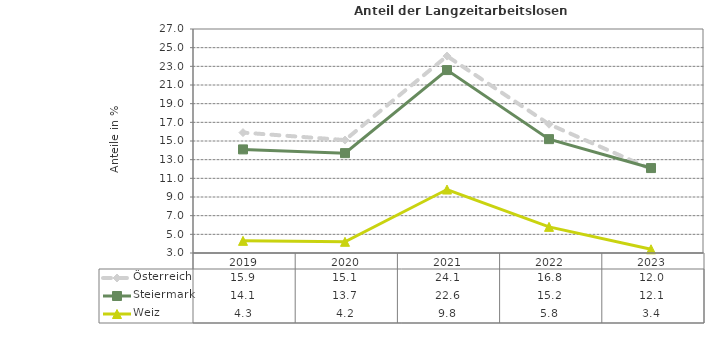
| Category | Österreich | Steiermark | Weiz |
|---|---|---|---|
| 2023.0 | 12 | 12.1 | 3.4 |
| 2022.0 | 16.8 | 15.2 | 5.8 |
| 2021.0 | 24.1 | 22.6 | 9.8 |
| 2020.0 | 15.1 | 13.7 | 4.2 |
| 2019.0 | 15.9 | 14.1 | 4.3 |